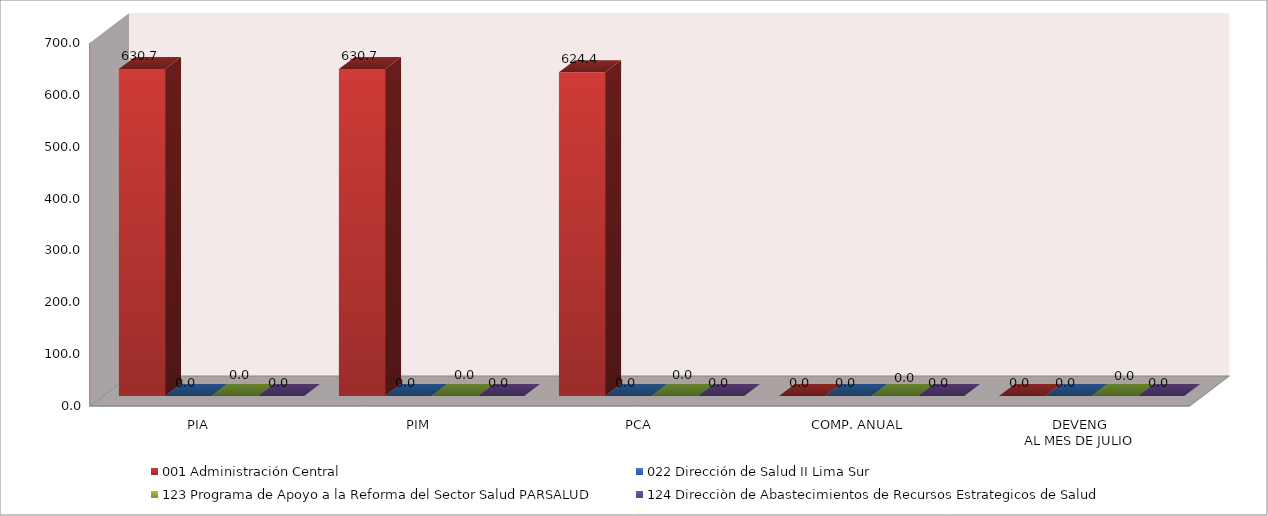
| Category | 001 Administración Central | 022 Dirección de Salud II Lima Sur | 123 Programa de Apoyo a la Reforma del Sector Salud PARSALUD | 124 Direcciòn de Abastecimientos de Recursos Estrategicos de Salud |
|---|---|---|---|---|
| PIA | 630.715 | 0 | 0 | 0 |
| PIM | 630.715 | 0 | 0 | 0 |
| PCA | 624.408 | 0 | 0 | 0 |
| COMP. ANUAL | 0 | 0 | 0 | 0 |
| DEVENG
AL MES DE JULIO | 0 | 0 | 0 | 0 |